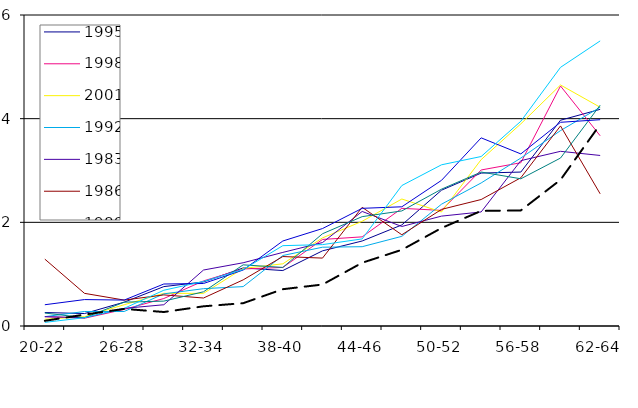
| Category | 1995 | 1998 | 2001 | 1992 | 1983 | 1986 | 1989 | 2004 | 2007 | 2010 |
|---|---|---|---|---|---|---|---|---|---|---|
| 20-22 | 0.26 | 0.18 | 0.13 | 0.18 | 0.18 | 1.29 | 0.25 | 0.41 | 0.07 | 0.1 |
| 23-25 | 0.24 | 0.15 | 0.18 | 0.28 | 0.16 | 0.63 | 0.16 | 0.51 | 0.16 | 0.22 |
| 26-28 | 0.46 | 0.32 | 0.41 | 0.28 | 0.34 | 0.5 | 0.46 | 0.5 | 0.34 | 0.33 |
| 29-31 | 0.76 | 0.53 | 0.63 | 0.62 | 0.41 | 0.6 | 0.48 | 0.81 | 0.69 | 0.27 |
| 32-34 | 0.85 | 0.87 | 0.63 | 0.72 | 1.08 | 0.54 | 0.66 | 0.82 | 0.86 | 0.38 |
| 35-37 | 1.12 | 1.1 | 1.11 | 0.76 | 1.22 | 0.89 | 1.18 | 1.08 | 1.09 | 0.44 |
| 38-40 | 1.07 | 1.13 | 1.2 | 1.36 | 1.42 | 1.34 | 1.13 | 1.64 | 1.55 | 0.71 |
| 41-43 | 1.45 | 1.67 | 1.7 | 1.52 | 1.61 | 1.31 | 1.78 | 1.88 | 1.57 | 0.8 |
| 44-46 | 1.64 | 1.72 | 2.02 | 1.53 | 2.21 | 2.29 | 2.11 | 2.27 | 1.68 | 1.22 |
| 47-49 | 1.95 | 2.27 | 2.45 | 1.73 | 1.92 | 1.76 | 2.22 | 2.3 | 2.71 | 1.47 |
| 50-52 | 2.62 | 2.23 | 2.2 | 2.35 | 2.12 | 2.25 | 2.64 | 2.81 | 3.11 | 1.89 |
| 53-55 | 2.95 | 3.01 | 3.21 | 2.76 | 2.2 | 2.44 | 2.97 | 3.63 | 3.27 | 2.22 |
| 56-58 | 2.97 | 3.15 | 3.9 | 3.24 | 3.19 | 2.86 | 2.84 | 3.32 | 3.95 | 2.23 |
| 59-61 | 3.97 | 4.63 | 4.65 | 3.77 | 3.37 | 3.86 | 3.24 | 3.93 | 4.99 | 2.82 |
| 62-64 | 4.18 | 3.67 | 4.22 | 4.22 | 3.29 | 2.55 | 4.26 | 3.98 | 5.5 | 3.89 |